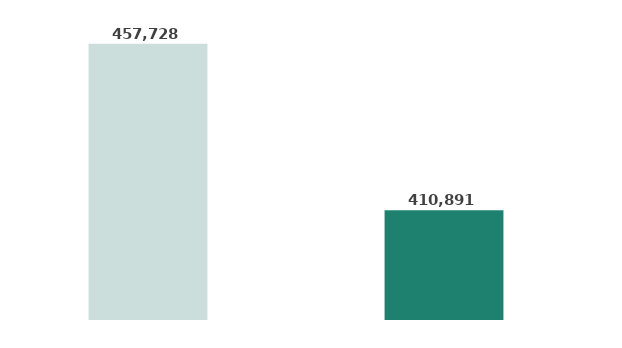
| Category | Series 0 |
|---|---|
| حتى الربع الرابع 2023م | 457727.835 |
| حتى الربع الرابع 2022م | 410891.411 |